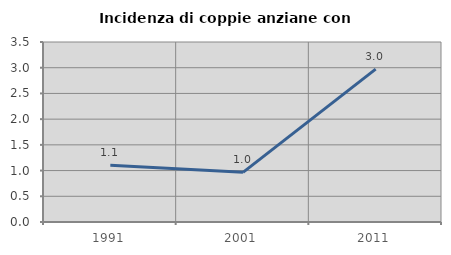
| Category | Incidenza di coppie anziane con figli |
|---|---|
| 1991.0 | 1.105 |
| 2001.0 | 0.965 |
| 2011.0 | 2.972 |